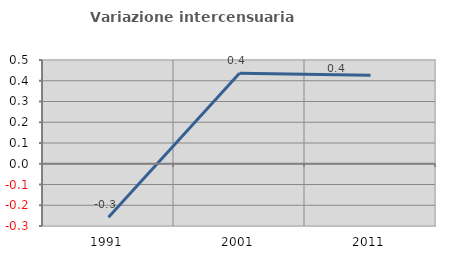
| Category | Variazione intercensuaria annua |
|---|---|
| 1991.0 | -0.258 |
| 2001.0 | 0.436 |
| 2011.0 | 0.426 |